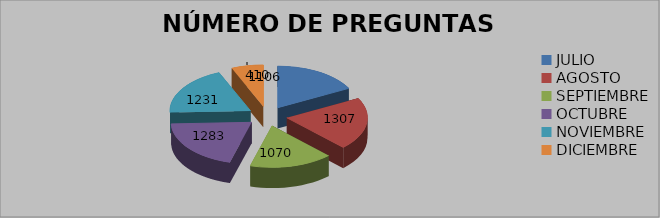
| Category | Series 0 |
|---|---|
| JULIO | 1106 |
| AGOSTO | 1307 |
| SEPTIEMBRE | 1070 |
| OCTUBRE | 1283 |
| NOVIEMBRE | 1231 |
| DICIEMBRE | 410 |